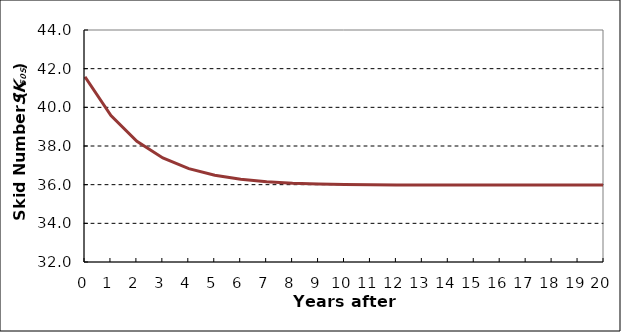
| Category | Series 0 |
|---|---|
| 0.0 | 41.581 |
| 1.0 | 39.573 |
| 2.0 | 38.244 |
| 3.0 | 37.381 |
| 4.0 | 36.831 |
| 5.0 | 36.487 |
| 6.0 | 36.276 |
| 7.0 | 36.15 |
| 8.0 | 36.075 |
| 9.0 | 36.033 |
| 10.0 | 36.009 |
| 11.0 | 35.995 |
| 12.0 | 35.988 |
| 13.0 | 35.985 |
| 14.0 | 35.983 |
| 15.0 | 35.982 |
| 16.0 | 35.981 |
| 17.0 | 35.981 |
| 18.0 | 35.981 |
| 19.0 | 35.981 |
| 20.0 | 35.981 |